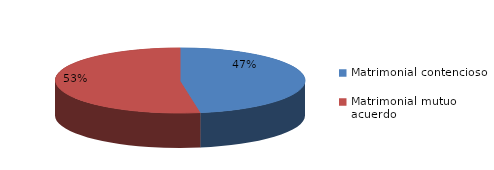
| Category | Series 0 |
|---|---|
| 0 | 110 |
| 1 | 122 |